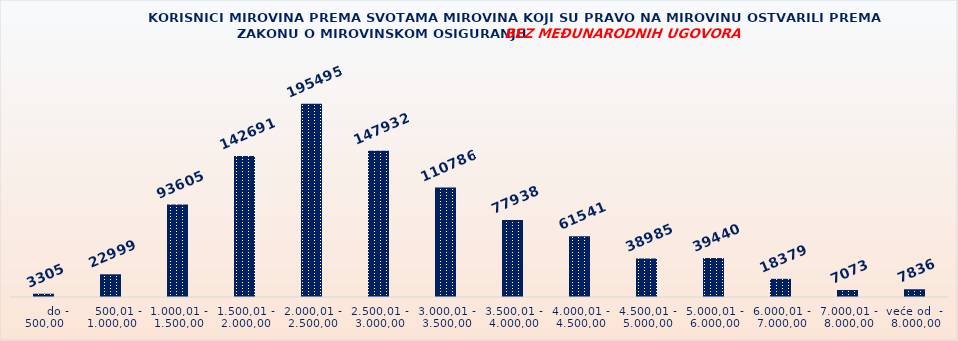
| Category | KORISNICI MIROVINA PREMA VRSTAMA I SVOTAMA MIROVINA KOJI SU PRAVO NA MIROVINU OSTVARILI PREMA ZAKONU O MIROVINSKOM OSIGURANJU 
BEZ MEĐUNARODNIH UGOVORA |
|---|---|
|       do - 500,00 | 3305 |
|    500,01 - 1.000,00 | 22999 |
| 1.000,01 - 1.500,00 | 93605 |
| 1.500,01 - 2.000,00 | 142691 |
| 2.000,01 - 2.500,00 | 195495 |
| 2.500,01 - 3.000,00 | 147932 |
| 3.000,01 - 3.500,00 | 110786 |
| 3.500,01 - 4.000,00 | 77938 |
| 4.000,01 - 4.500,00 | 61541 |
| 4.500,01 - 5.000,00 | 38985 |
| 5.000,01 - 6.000,00 | 39440 |
| 6.000,01 - 7.000,00 | 18379 |
| 7.000,01 - 8.000,00 | 7073 |
| veće od  -  8.000,00 | 7836 |